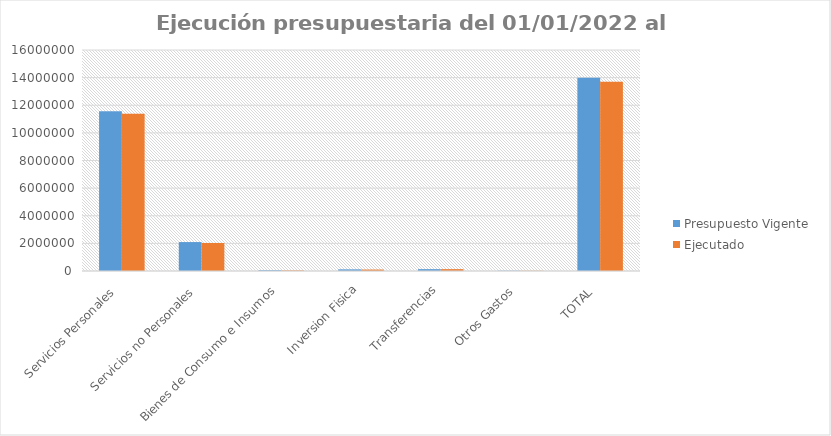
| Category | Presupuesto Vigente  | Ejecutado  |
|---|---|---|
| Servicios Personales  | 11562245.025 | 11377260.124 |
| Servicios no Personales  | 2095121.971 | 2026879.513 |
| Bienes de Consumo e Insumos  | 56255 | 40345.85 |
| Inversion Fisica | 119000 | 105600.126 |
| Transferencias | 135000 | 135000 |
| Otros Gastos  | 20040.053 | 17360.916 |
| TOTAL  | 13987662.049 | 13702446.529 |